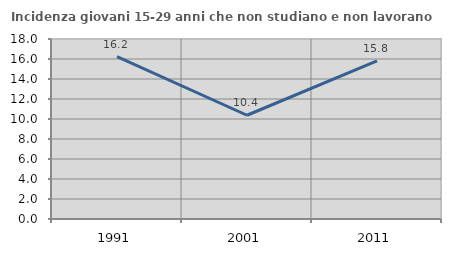
| Category | Incidenza giovani 15-29 anni che non studiano e non lavorano  |
|---|---|
| 1991.0 | 16.244 |
| 2001.0 | 10.376 |
| 2011.0 | 15.823 |